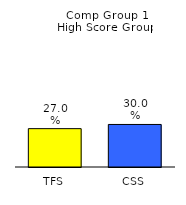
| Category | Series 0 |
|---|---|
| TFS | 0.27 |
| CSS | 0.3 |